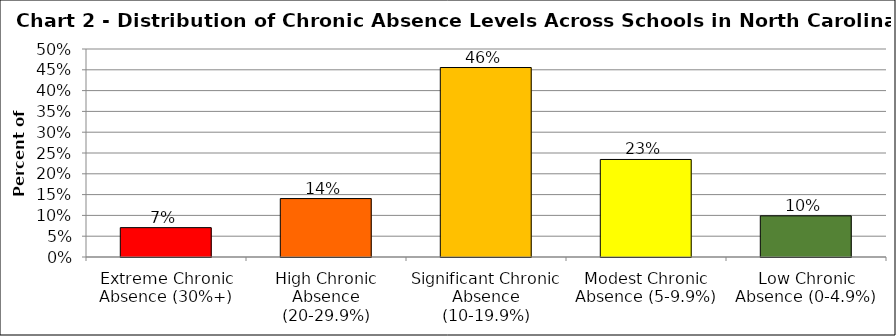
| Category | Series 1 |
|---|---|
| Extreme Chronic Absence (30%+) | 0.071 |
| High Chronic Absence (20-29.9%) | 0.14 |
| Significant Chronic Absence (10-19.9%) | 0.455 |
| Modest Chronic Absence (5-9.9%) | 0.234 |
| Low Chronic Absence (0-4.9%) | 0.099 |